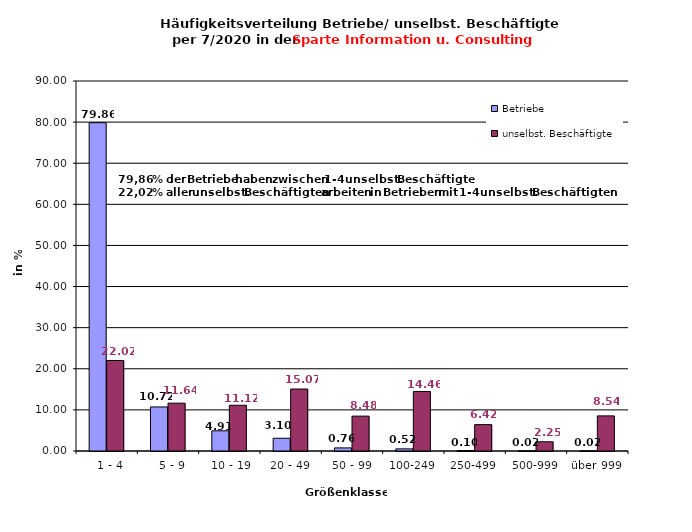
| Category | Betriebe | unselbst. Beschäftigte |
|---|---|---|
|   1 - 4 | 79.857 | 22.019 |
|   5 - 9 | 10.718 | 11.638 |
|  10 - 19 | 4.912 | 11.124 |
| 20 - 49 | 3.102 | 15.072 |
| 50 - 99 | 0.756 | 8.48 |
| 100-249 | 0.517 | 14.464 |
| 250-499 | 0.099 | 6.417 |
| 500-999 | 0.02 | 2.246 |
| über 999 | 0.02 | 8.541 |